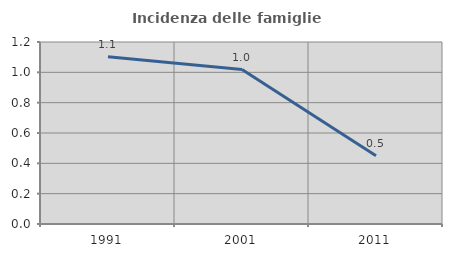
| Category | Incidenza delle famiglie numerose |
|---|---|
| 1991.0 | 1.102 |
| 2001.0 | 1.019 |
| 2011.0 | 0.45 |